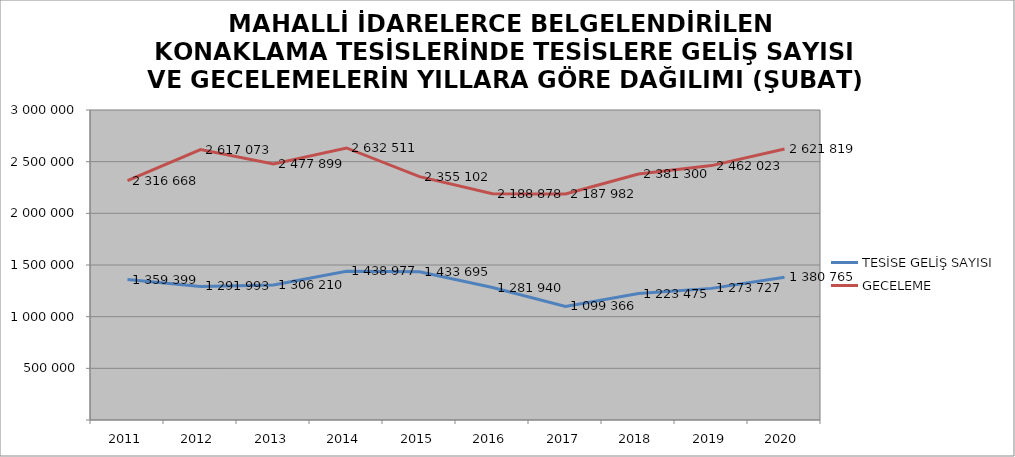
| Category | TESİSE GELİŞ SAYISI | GECELEME |
|---|---|---|
| 2011 | 1359399 | 2316668 |
| 2012 | 1291993 | 2617073 |
| 2013 | 1306210 | 2477899 |
| 2014 | 1438977 | 2632511 |
| 2015 | 1433695 | 2355102 |
| 2016 | 1281940 | 2188878 |
| 2017 | 1099366 | 2187982 |
| 2018 | 1223475 | 2381300 |
| 2019 | 1273727 | 2462023 |
| 2020 | 1380765 | 2621819 |